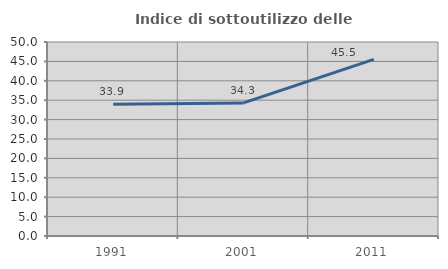
| Category | Indice di sottoutilizzo delle abitazioni  |
|---|---|
| 1991.0 | 33.929 |
| 2001.0 | 34.296 |
| 2011.0 | 45.529 |